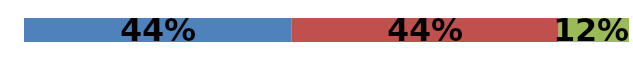
| Category | Series 0 | Series 1 | Series 2 |
|---|---|---|---|
| 0 | 0.442 | 0.442 | 0.116 |